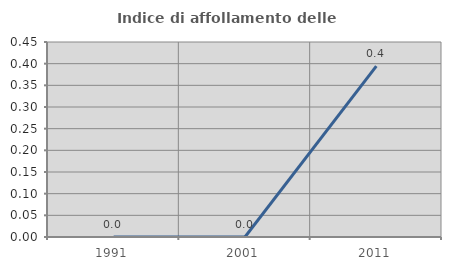
| Category | Indice di affollamento delle abitazioni  |
|---|---|
| 1991.0 | 0 |
| 2001.0 | 0 |
| 2011.0 | 0.394 |